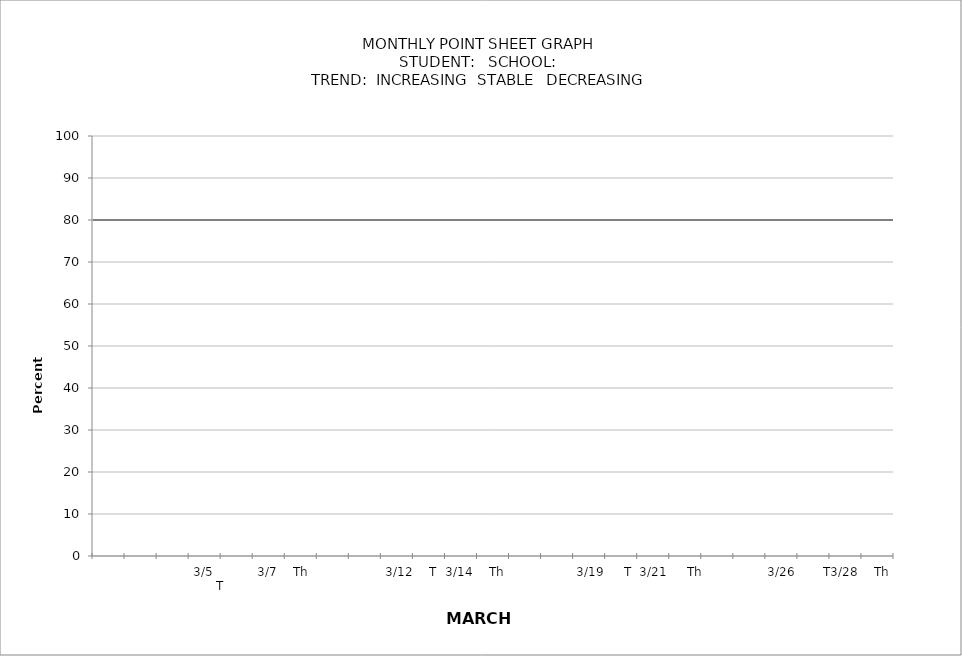
| Category | PERCENTAGE | target |
|---|---|---|
|  |  | 80 |
| 3/1         F |  | 80 |
|  |  | 80 |
| 3/4     M |  | 80 |
| 3/5          T |  | 80 |
| 3/6     W |  | 80 |
| 3/7    Th |  | 80 |
| 3/8        F |  | 80 |
|  |  | 80 |
| 3/11   M |  | 80 |
| 3/12    T |  | 80 |
| 3/13   W |  | 80 |
| 3/14    Th |  | 80 |
| 3/15    F |  | 80 |
|  |  | 80 |
| 3/18     M |  | 80 |
| 3/19     T |  | 80 |
| 3/20    W |  | 80 |
| 3/21     Th |  | 80 |
| 3/22     F |  | 80 |
|  |  | 80 |
| 3/25   M |  | 80 |
| 3/26       T |  | 80 |
| 3/27    W |  | 80 |
| 3/28    Th |  | 80 |
| 3/29    F |  | 80 |